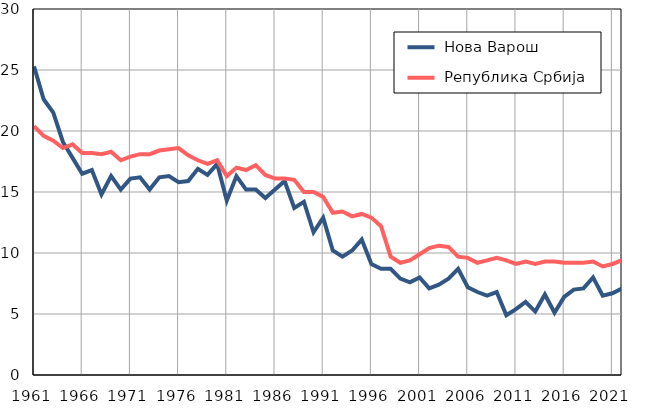
| Category |  Нова Варош |  Република Србија |
|---|---|---|
| 1961.0 | 25.3 | 20.4 |
| 1962.0 | 22.6 | 19.6 |
| 1963.0 | 21.5 | 19.2 |
| 1964.0 | 19.1 | 18.6 |
| 1965.0 | 17.8 | 18.9 |
| 1966.0 | 16.5 | 18.2 |
| 1967.0 | 16.8 | 18.2 |
| 1968.0 | 14.8 | 18.1 |
| 1969.0 | 16.3 | 18.3 |
| 1970.0 | 15.2 | 17.6 |
| 1971.0 | 16.1 | 17.9 |
| 1972.0 | 16.2 | 18.1 |
| 1973.0 | 15.2 | 18.1 |
| 1974.0 | 16.2 | 18.4 |
| 1975.0 | 16.3 | 18.5 |
| 1976.0 | 15.8 | 18.6 |
| 1977.0 | 15.9 | 18 |
| 1978.0 | 16.9 | 17.6 |
| 1979.0 | 16.4 | 17.3 |
| 1980.0 | 17.3 | 17.6 |
| 1981.0 | 14.3 | 16.3 |
| 1982.0 | 16.3 | 17 |
| 1983.0 | 15.2 | 16.8 |
| 1984.0 | 15.2 | 17.2 |
| 1985.0 | 14.5 | 16.4 |
| 1986.0 | 15.2 | 16.1 |
| 1987.0 | 15.9 | 16.1 |
| 1988.0 | 13.7 | 16 |
| 1989.0 | 14.2 | 15 |
| 1990.0 | 11.7 | 15 |
| 1991.0 | 12.9 | 14.6 |
| 1992.0 | 10.2 | 13.3 |
| 1993.0 | 9.7 | 13.4 |
| 1994.0 | 10.2 | 13 |
| 1995.0 | 11.1 | 13.2 |
| 1996.0 | 9.1 | 12.9 |
| 1997.0 | 8.7 | 12.2 |
| 1998.0 | 8.7 | 9.7 |
| 1999.0 | 7.9 | 9.2 |
| 2000.0 | 7.6 | 9.4 |
| 2001.0 | 8 | 9.9 |
| 2002.0 | 7.1 | 10.4 |
| 2003.0 | 7.4 | 10.6 |
| 2004.0 | 7.9 | 10.5 |
| 2005.0 | 8.7 | 9.7 |
| 2006.0 | 7.2 | 9.6 |
| 2007.0 | 6.8 | 9.2 |
| 2008.0 | 6.5 | 9.4 |
| 2009.0 | 6.8 | 9.6 |
| 2010.0 | 4.9 | 9.4 |
| 2011.0 | 5.4 | 9.1 |
| 2012.0 | 6 | 9.3 |
| 2013.0 | 5.2 | 9.1 |
| 2014.0 | 6.6 | 9.3 |
| 2015.0 | 5.1 | 9.3 |
| 2016.0 | 6.4 | 9.2 |
| 2017.0 | 7 | 9.2 |
| 2018.0 | 7.1 | 9.2 |
| 2019.0 | 8 | 9.3 |
| 2020.0 | 6.5 | 8.9 |
| 2021.0 | 6.7 | 9.1 |
| 2022.0 | 7.1 | 9.4 |